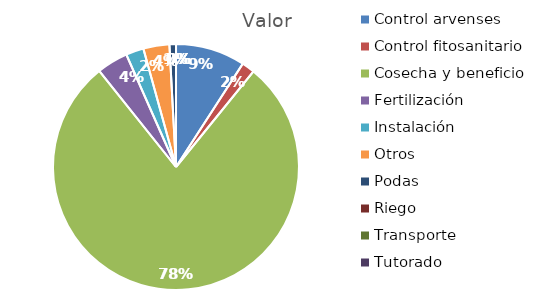
| Category | Valor |
|---|---|
| Control arvenses | 10266704 |
| Control fitosanitario | 1925010 |
| Cosecha y beneficio | 88158141 |
| Fertilización | 4620024 |
| Instalación | 2630847 |
| Otros | 3850020 |
| Podas | 962505 |
| Riego | 0 |
| Transporte | 0 |
| Tutorado | 0 |